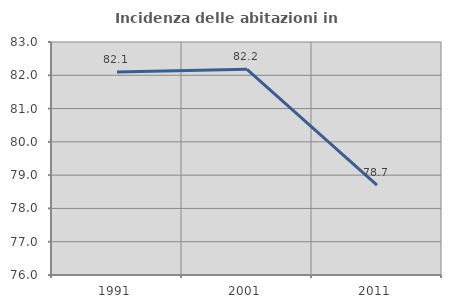
| Category | Incidenza delle abitazioni in proprietà  |
|---|---|
| 1991.0 | 82.095 |
| 2001.0 | 82.181 |
| 2011.0 | 78.702 |